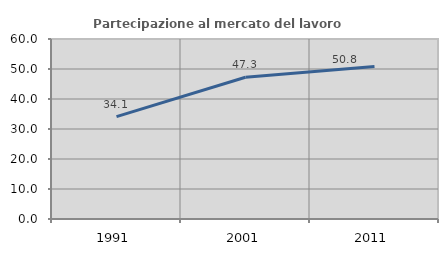
| Category | Partecipazione al mercato del lavoro  femminile |
|---|---|
| 1991.0 | 34.123 |
| 2001.0 | 47.265 |
| 2011.0 | 50.833 |